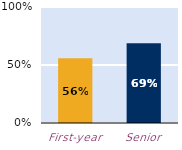
| Category | At least some |
|---|---|
| First-year | 0.558 |
| Senior | 0.688 |